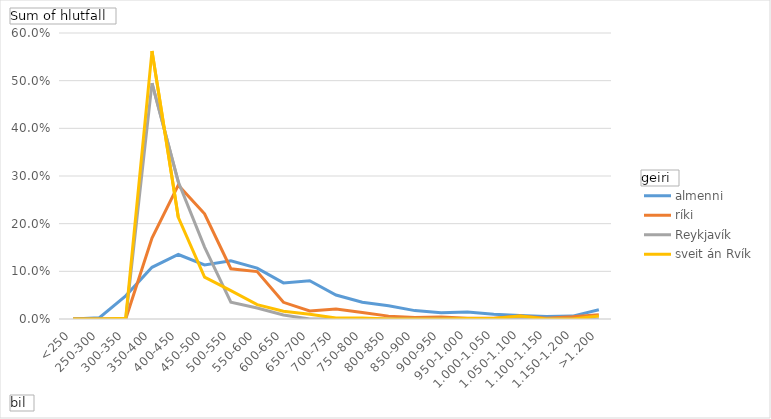
| Category | almenni | ríki | Reykjavík | sveit án Rvík |
|---|---|---|---|---|
| <250 | 0 | 0 | 0 | 0 |
| 250-300 | 0.003 | 0 | 0 | 0 |
| 300-350 | 0.049 | 0 | 0 | 0.002 |
| 350-400 | 0.108 | 0.17 | 0.495 | 0.562 |
| 400-450 | 0.135 | 0.281 | 0.288 | 0.213 |
| 450-500 | 0.113 | 0.221 | 0.151 | 0.088 |
| 500-550 | 0.122 | 0.105 | 0.035 | 0.06 |
| 550-600 | 0.107 | 0.1 | 0.023 | 0.03 |
| 600-650 | 0.076 | 0.035 | 0.008 | 0.016 |
| 650-700 | 0.08 | 0.017 | 0 | 0.01 |
| 700-750 | 0.05 | 0.021 | 0 | 0.002 |
| 750-800 | 0.035 | 0.014 | 0 | 0.002 |
| 800-850 | 0.028 | 0.006 | 0 | 0 |
| 850-900 | 0.018 | 0.003 | 0 | 0 |
| 900-950 | 0.013 | 0.004 | 0 | 0 |
| 950-1.000 | 0.015 | 0.001 | 0 | 0.001 |
| 1.000-1.050 | 0.01 | 0.002 | 0 | 0.001 |
| 1.050-1.100 | 0.007 | 0.006 | 0 | 0.006 |
| 1.100-1.150 | 0.005 | 0.002 | 0 | 0 |
| 1.150-1.200 | 0.006 | 0.005 | 0 | 0 |
| >1.200 | 0.02 | 0.009 | 0 | 0.006 |